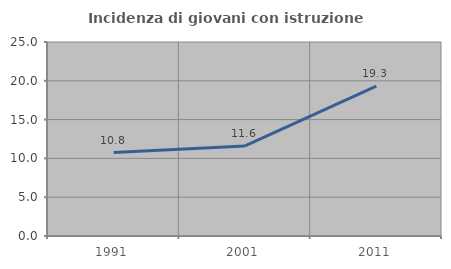
| Category | Incidenza di giovani con istruzione universitaria |
|---|---|
| 1991.0 | 10.759 |
| 2001.0 | 11.604 |
| 2011.0 | 19.304 |